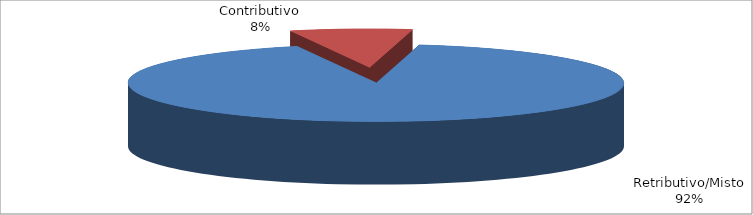
| Category | Decorrenti gennaio - giugno 2022 |
|---|---|
| Retributivo/Misto | 33610 |
| Contributivo | 2899 |